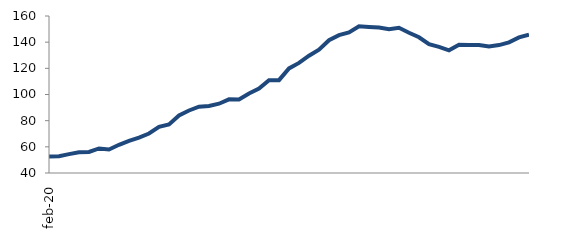
| Category | Series 0 |
|---|---|
| 2020-02-01 | 52.619 |
| 2020-03-01 | 52.83 |
| 2020-04-01 | 54.43 |
| 2020-05-01 | 55.851 |
| 2020-06-01 | 56.062 |
| 2020-07-01 | 58.766 |
| 2020-08-01 | 57.967 |
| 2020-09-01 | 61.563 |
| 2020-10-01 | 64.611 |
| 2020-11-01 | 67.053 |
| 2020-12-01 | 70.207 |
| 2021-01-01 | 75.283 |
| 2021-02-01 | 77.125 |
| 2021-03-01 | 83.917 |
| 2021-04-01 | 87.772 |
| 2021-05-01 | 90.698 |
| 2021-06-01 | 91.254 |
| 2021-07-01 | 92.957 |
| 2021-08-01 | 96.281 |
| 2021-09-01 | 96.228 |
| 2021-10-01 | 100.807 |
| 2021-11-01 | 104.506 |
| 2021-12-01 | 110.93 |
| 2022-01-01 | 110.966 |
| 2022-02-01 | 119.928 |
| 2022-03-01 | 124.133 |
| 2022-04-01 | 129.687 |
| 2022-05-01 | 134.267 |
| 2022-06-01 | 141.471 |
| 2022-07-01 | 145.357 |
| 2022-08-01 | 147.378 |
| 2022-09-01 | 152.132 |
| 2022-10-01 | 151.659 |
| 2022-11-01 | 151.229 |
| 2022-12-01 | 149.84 |
| 2023-01-01 | 151.047 |
| 2023-02-01 | 147.233 |
| 2023-03-01 | 143.736 |
| 2023-04-01 | 138.403 |
| 2023-05-01 | 136.434 |
| 2023-06-01 | 133.747 |
| 2023-07-01 | 138.012 |
| 2023-08-01 | 137.887 |
| 2023-09-01 | 137.892 |
| 2023-10-01 | 136.697 |
| 2023-11-01 | 137.783 |
| 2023-12-01 | 139.894 |
| 2024-01-01 | 143.622 |
| 2024-02-01 | 145.819 |